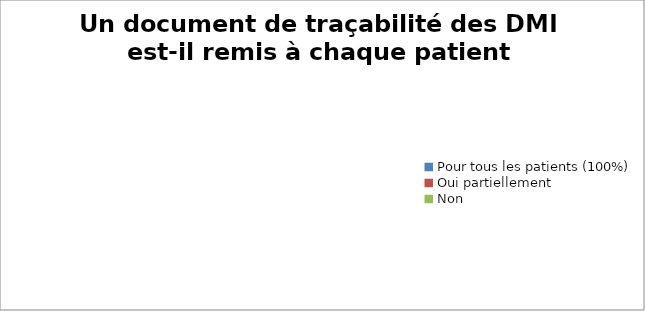
| Category | Un document de traçabilité des DMI est-il remis à chaque patient concerné ? |
|---|---|
| Pour tous les patients (100%) | 0 |
| Oui partiellement | 0 |
| Non | 0 |